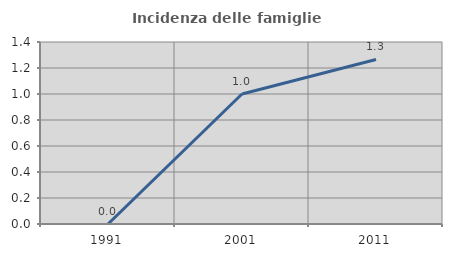
| Category | Incidenza delle famiglie numerose |
|---|---|
| 1991.0 | 0 |
| 2001.0 | 1 |
| 2011.0 | 1.266 |